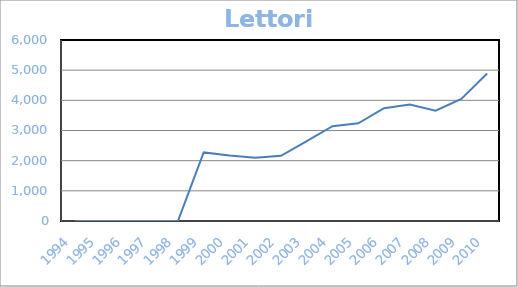
| Category | Lettori attivi   |
|---|---|
| 1994.0 | 0 |
| 1995.0 | 0 |
| 1996.0 | 0 |
| 1997.0 | 0 |
| 1998.0 | 0 |
| 1999.0 | 2273 |
| 2000.0 | 2170 |
| 2001.0 | 2098 |
| 2002.0 | 2163 |
| 2003.0 | 2649 |
| 2004.0 | 3143 |
| 2005.0 | 3240 |
| 2006.0 | 3741 |
| 2007.0 | 3860 |
| 2008.0 | 3657 |
| 2009.0 | 4048 |
| 2010.0 | 4890 |